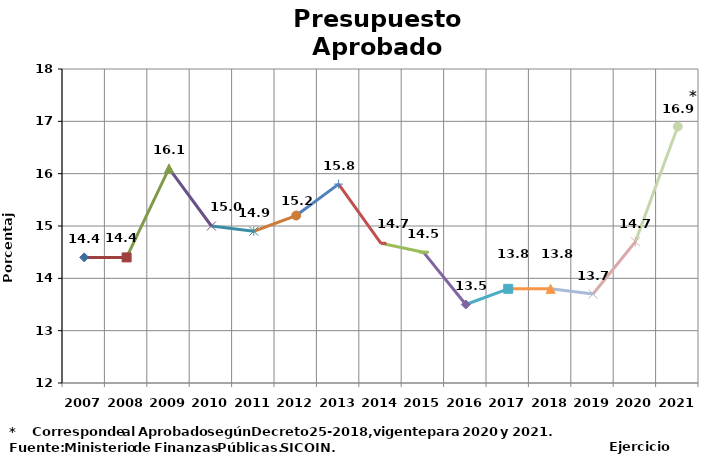
| Category | Series 0 |
|---|---|
| 2007 | 14.4 |
| 2008 | 14.4 |
| 2009 | 16.1 |
| 2010 | 15 |
| 2011 | 14.9 |
| 2012 | 15.2 |
| 2013 | 15.8 |
| 2014 | 14.67 |
| 2015 | 14.5 |
| 2016 | 13.5 |
| 2017 | 13.8 |
| 2018 | 13.8 |
| 2019 | 13.7 |
| 2020 | 14.7 |
| 2021 | 16.9 |